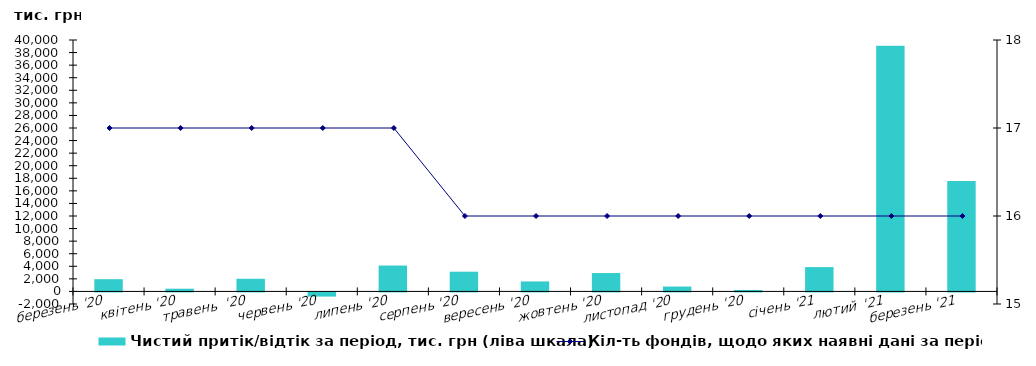
| Category | Чистий притік/відтік за період, тис. грн (ліва шкала) |
|---|---|
| березень '20 | 1946.081 |
| квітень '20 | 431.13 |
| травень  '20 | 2014.529 |
| червень '20 | -664.026 |
| липень '20 | 4118.162 |
| серпень '20 | 3141.082 |
| вересень '20 | 1590.018 |
| жовтень '20 | 2925.693 |
| листопад '20 | 777.855 |
| грудень '20 | 224.618 |
| січень '21 | 3870.284 |
| лютий  '21 | 39078.998 |
| березень '21 | 17584.613 |